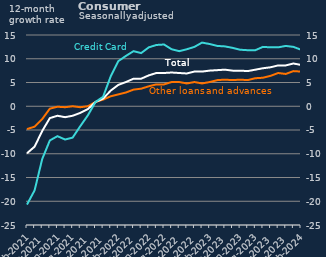
| Category | Other loans and advances | Total |
|---|---|---|
| Feb-2021 | -4.8 | -9.9 |
| Mar-2021 | -4.3 | -8.5 |
| Apr-2021 | -2.7 | -5.2 |
| May-2021 | -0.5 | -2.5 |
| Jun-2021 | -0.1 | -2 |
| Jul-2021 | -0.2 | -2.3 |
| Aug-2021 | 0 | -2 |
| Sep-2021 | -0.2 | -1.4 |
| Oct-2021 | 0 | -0.6 |
| Nov-2021 | 0.9 | 0.9 |
| Dec-2021 | 1.4 | 1.6 |
| Jan-2022 | 2.1 | 3.3 |
| Feb-2022 | 2.5 | 4.5 |
| Mar-2022 | 2.9 | 5.1 |
| Apr-2022 | 3.5 | 5.8 |
| May-2022 | 3.7 | 5.8 |
| Jun-2022 | 4.2 | 6.5 |
| Jul-2022 | 4.6 | 7 |
| Aug-2022 | 4.6 | 7 |
| Sep-2022 | 5.1 | 7.1 |
| Oct-2022 | 5.1 | 7 |
| Nov-2022 | 4.8 | 6.9 |
| Dec-2022 | 5.1 | 7.3 |
| Jan-2023 | 4.8 | 7.3 |
| Feb-2023 | 5.1 | 7.5 |
| Mar-2023 | 5.5 | 7.6 |
| Apr-2023 | 5.6 | 7.7 |
| May-2023 | 5.5 | 7.5 |
| Jun-2023 | 5.6 | 7.5 |
| Jul-2023 | 5.5 | 7.4 |
| Aug-2023 | 5.9 | 7.7 |
| Sep-2023 | 6 | 8 |
| Oct-2023 | 6.4 | 8.2 |
| Nov-2023 | 7 | 8.6 |
| Dec-2023 | 6.8 | 8.6 |
| Jan-2024 | 7.4 | 9 |
| Feb-2024 | 7.3 | 8.7 |